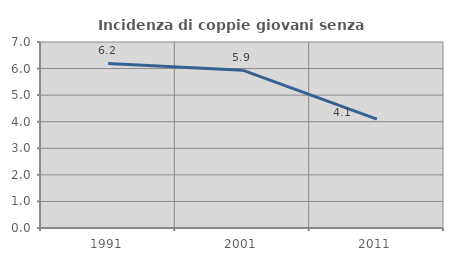
| Category | Incidenza di coppie giovani senza figli |
|---|---|
| 1991.0 | 6.195 |
| 2001.0 | 5.94 |
| 2011.0 | 4.095 |